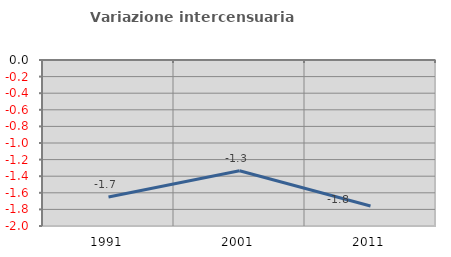
| Category | Variazione intercensuaria annua |
|---|---|
| 1991.0 | -1.651 |
| 2001.0 | -1.335 |
| 2011.0 | -1.76 |